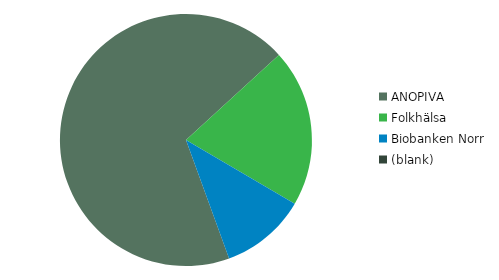
| Category | Summa |
|---|---|
| ANOPIVA | 4400 |
| Folkhälsa | 1295 |
| Biobanken Norr | 705 |
| (blank) | 0 |